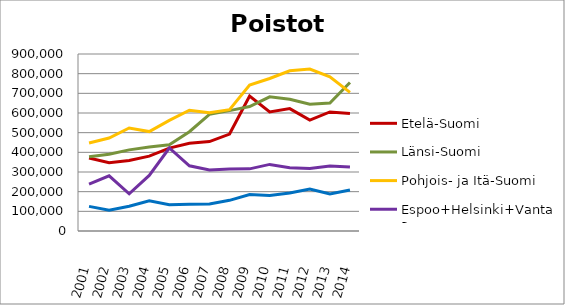
| Category | Etelä-Suomi | Länsi-Suomi | Pohjois- ja Itä-Suomi | Espoo+Helsinki+Vantaa | Muu Uusimaa |
|---|---|---|---|---|---|
| 2001.0 | 370921 | 377009 | 447653 | 238745 | 125328 |
| 2002.0 | 347620 | 389871 | 472943 | 280602 | 105166 |
| 2003.0 | 358290 | 412529 | 523810 | 189111 | 125765 |
| 2004.0 | 380470 | 427418 | 505646 | 282423 | 153732 |
| 2005.0 | 421717 | 438361 | 562553 | 422058 | 133450 |
| 2006.0 | 446505 | 504665 | 613961 | 331524 | 135951 |
| 2007.0 | 454766 | 593118 | 601940 | 310006 | 137704 |
| 2008.0 | 492969 | 611972 | 617177 | 314727 | 155887 |
| 2009.0 | 686662 | 632943 | 741611 | 316035 | 185793 |
| 2010.0 | 605736 | 682488 | 775429 | 338599 | 180357 |
| 2011.0 | 622209 | 670040 | 814357 | 322052 | 193692 |
| 2012.0 | 564270 | 644660 | 823251 | 317663 | 213789 |
| 2013.0 | 605411 | 651097 | 783729 | 331071 | 188008 |
| 2014.0 | 597168 | 755284 | 704790 | 325125 | 208808 |